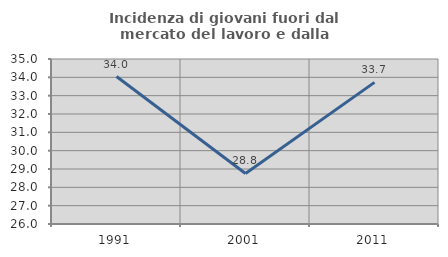
| Category | Incidenza di giovani fuori dal mercato del lavoro e dalla formazione  |
|---|---|
| 1991.0 | 34.044 |
| 2001.0 | 28.756 |
| 2011.0 | 33.724 |